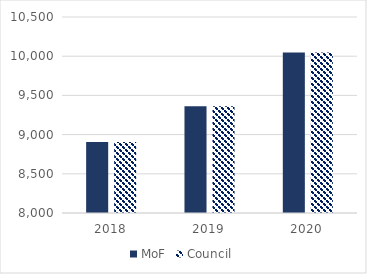
| Category | MoF | Council |
|---|---|---|
| 2018.0 | 8906.843 | 8906.843 |
| 2019.0 | 9360.692 | 9360.692 |
| 2020.0 | 10047.953 | 10047.953 |